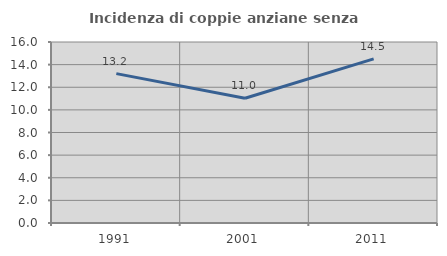
| Category | Incidenza di coppie anziane senza figli  |
|---|---|
| 1991.0 | 13.202 |
| 2001.0 | 11.026 |
| 2011.0 | 14.512 |